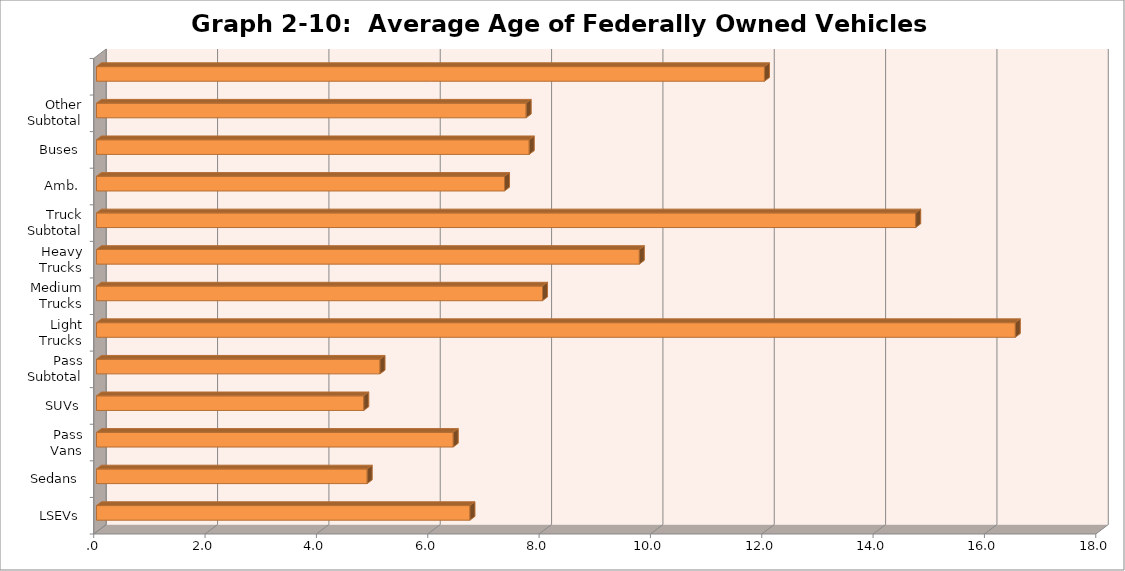
| Category | Total All Agencies |
|---|---|
| LSEVs | 6.708 |
| Sedans | 4.862 |
| Pass
Vans | 6.408 |
| SUVs | 4.801 |
| Pass
Subtotal | 5.093 |
| Light
Trucks | 16.505 |
| Medium
Trucks | 8.012 |
| Heavy
Trucks | 9.751 |
| Truck
Subtotal | 14.716 |
| Amb. | 7.329 |
| Buses | 7.773 |
| Other
Subtotal | 7.718 |